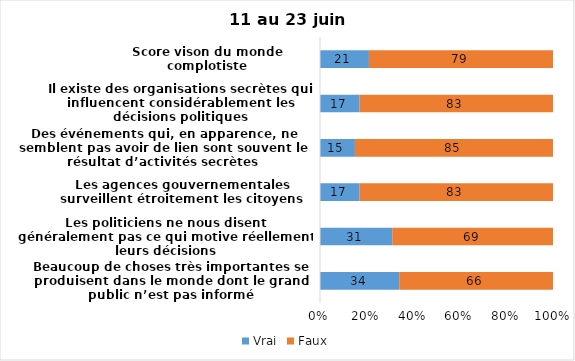
| Category | Vrai | Faux |
|---|---|---|
| Beaucoup de choses très importantes se produisent dans le monde dont le grand public n’est pas informé | 34 | 66 |
| Les politiciens ne nous disent généralement pas ce qui motive réellement leurs décisions | 31 | 69 |
| Les agences gouvernementales surveillent étroitement les citoyens | 17 | 83 |
| Des événements qui, en apparence, ne semblent pas avoir de lien sont souvent le résultat d’activités secrètes | 15 | 85 |
| Il existe des organisations secrètes qui influencent considérablement les décisions politiques | 17 | 83 |
| Score vison du monde complotiste | 21 | 79 |